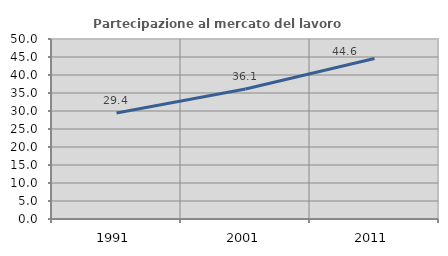
| Category | Partecipazione al mercato del lavoro  femminile |
|---|---|
| 1991.0 | 29.429 |
| 2001.0 | 36.092 |
| 2011.0 | 44.582 |